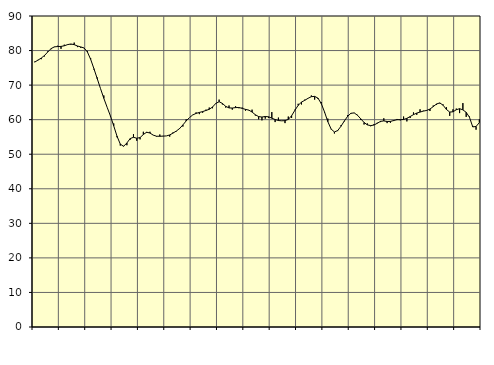
| Category | Piggar | Series 1 |
|---|---|---|
| nan | 76.8 | 76.65 |
| 87.0 | 77.3 | 77.22 |
| 87.0 | 77.5 | 77.82 |
| 87.0 | 78.3 | 78.58 |
| nan | 79.8 | 79.6 |
| 88.0 | 80.4 | 80.57 |
| 88.0 | 81 | 81.07 |
| 88.0 | 81.4 | 81.16 |
| nan | 80.5 | 81.2 |
| 89.0 | 81.7 | 81.38 |
| 89.0 | 81.8 | 81.72 |
| 89.0 | 81.7 | 81.9 |
| nan | 82.3 | 81.71 |
| 90.0 | 81 | 81.32 |
| 90.0 | 80.8 | 81.05 |
| 90.0 | 80.7 | 80.75 |
| nan | 79.9 | 79.63 |
| 91.0 | 77.8 | 77.47 |
| 91.0 | 74.5 | 74.74 |
| 91.0 | 72.2 | 71.86 |
| nan | 69 | 68.99 |
| 92.0 | 67 | 66.18 |
| 92.0 | 63.6 | 63.6 |
| 92.0 | 61 | 61.09 |
| nan | 58.9 | 58.22 |
| 93.0 | 54.9 | 55.22 |
| 93.0 | 52.5 | 52.93 |
| 93.0 | 52.4 | 52.29 |
| nan | 52.6 | 53.26 |
| 94.0 | 54.2 | 54.53 |
| 94.0 | 55.8 | 54.9 |
| 94.0 | 53.9 | 54.63 |
| nan | 54.3 | 54.81 |
| 95.0 | 56.5 | 55.71 |
| 95.0 | 56.2 | 56.37 |
| 95.0 | 56.5 | 56.13 |
| nan | 55.5 | 55.53 |
| 96.0 | 55.1 | 55.21 |
| 96.0 | 55.7 | 55.19 |
| 96.0 | 55.3 | 55.24 |
| nan | 55.3 | 55.3 |
| 97.0 | 55.1 | 55.58 |
| 97.0 | 56.3 | 56.11 |
| 97.0 | 56.6 | 56.7 |
| nan | 57.3 | 57.43 |
| 98.0 | 58 | 58.48 |
| 98.0 | 60.1 | 59.63 |
| 98.0 | 60.6 | 60.6 |
| nan | 61.4 | 61.37 |
| 99.0 | 62.1 | 61.81 |
| 99.0 | 61.6 | 62.09 |
| 99.0 | 62 | 62.34 |
| nan | 62.9 | 62.66 |
| 0.0 | 63.5 | 63 |
| 0.0 | 63.3 | 63.66 |
| 0.0 | 64.6 | 64.71 |
| nan | 65.8 | 65.19 |
| 1.0 | 64.4 | 64.7 |
| 1.0 | 63.5 | 63.85 |
| 1.0 | 64.1 | 63.4 |
| nan | 62.9 | 63.37 |
| 2.0 | 63.9 | 63.49 |
| 2.0 | 63.3 | 63.52 |
| 2.0 | 63.5 | 63.27 |
| nan | 62.6 | 62.98 |
| 3.0 | 62.7 | 62.77 |
| 3.0 | 62.9 | 62.21 |
| 3.0 | 61.2 | 61.42 |
| nan | 60.1 | 60.89 |
| 4.0 | 59.8 | 60.76 |
| 4.0 | 60.3 | 60.92 |
| 4.0 | 60.5 | 60.83 |
| nan | 62.2 | 60.43 |
| 5.0 | 59.3 | 60.04 |
| 5.0 | 60.6 | 59.75 |
| 5.0 | 59.7 | 59.67 |
| nan | 59 | 59.72 |
| 6.0 | 60.9 | 60.07 |
| 6.0 | 60.5 | 61.14 |
| 6.0 | 62.9 | 62.7 |
| nan | 64.6 | 64.15 |
| 7.0 | 64.4 | 65.08 |
| 7.0 | 65.8 | 65.6 |
| 7.0 | 66.2 | 66.18 |
| nan | 67 | 66.65 |
| 8.0 | 65.8 | 66.74 |
| 8.0 | 66 | 66.24 |
| 8.0 | 65.1 | 64.67 |
| nan | 62.1 | 62.24 |
| 9.0 | 60.3 | 59.42 |
| 9.0 | 57.2 | 57.29 |
| 9.0 | 56 | 56.44 |
| nan | 56.7 | 56.85 |
| 10.0 | 58.4 | 58.1 |
| 10.0 | 59.5 | 59.6 |
| 10.0 | 61.3 | 60.95 |
| nan | 61.7 | 61.85 |
| 11.0 | 62 | 61.95 |
| 11.0 | 61.4 | 61.28 |
| 11.0 | 59.9 | 60.24 |
| nan | 58.6 | 59.19 |
| 12.0 | 58.9 | 58.49 |
| 12.0 | 58.1 | 58.28 |
| 12.0 | 58.7 | 58.44 |
| nan | 59.1 | 58.95 |
| 13.0 | 59.3 | 59.51 |
| 13.0 | 60.4 | 59.64 |
| 13.0 | 59 | 59.47 |
| nan | 59.1 | 59.49 |
| 14.0 | 59.6 | 59.76 |
| 14.0 | 60.2 | 59.99 |
| 14.0 | 59.8 | 60 |
| nan | 60.9 | 60.05 |
| 15.0 | 59.5 | 60.39 |
| 15.0 | 60.5 | 60.9 |
| 15.0 | 62.1 | 61.46 |
| nan | 61.4 | 61.9 |
| 16.0 | 63 | 62.2 |
| 16.0 | 62.6 | 62.48 |
| 16.0 | 62.8 | 62.67 |
| nan | 62.5 | 63.07 |
| 17.0 | 64.1 | 63.78 |
| 17.0 | 64.3 | 64.54 |
| 17.0 | 64.7 | 64.85 |
| nan | 64.4 | 64.18 |
| 18.0 | 63.6 | 62.96 |
| 18.0 | 61.1 | 62.2 |
| 18.0 | 63 | 62.28 |
| nan | 63.2 | 62.87 |
| 19.0 | 61.9 | 63.18 |
| 19.0 | 64.8 | 62.84 |
| 19.0 | 60.8 | 62.12 |
| nan | 60.9 | 60.69 |
| 20.0 | 58.2 | 57.9 |
| 20.0 | 57.1 | 58.04 |
| 20.0 | 60.1 | 59.14 |